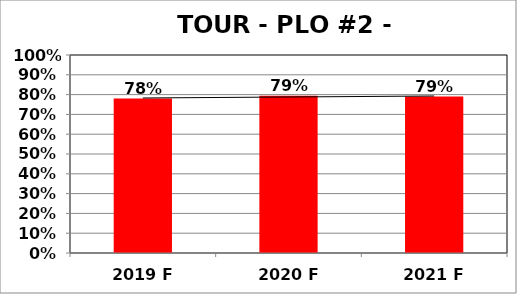
| Category | Series 0 |
|---|---|
| 2019 F | 0.78 |
| 2020 F | 0.794 |
| 2021 F | 0.79 |